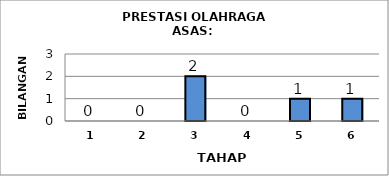
| Category | Series 0 |
|---|---|
| 1.0 | 0 |
| 2.0 | 0 |
| 3.0 | 2 |
| 4.0 | 0 |
| 5.0 | 1 |
| 6.0 | 1 |